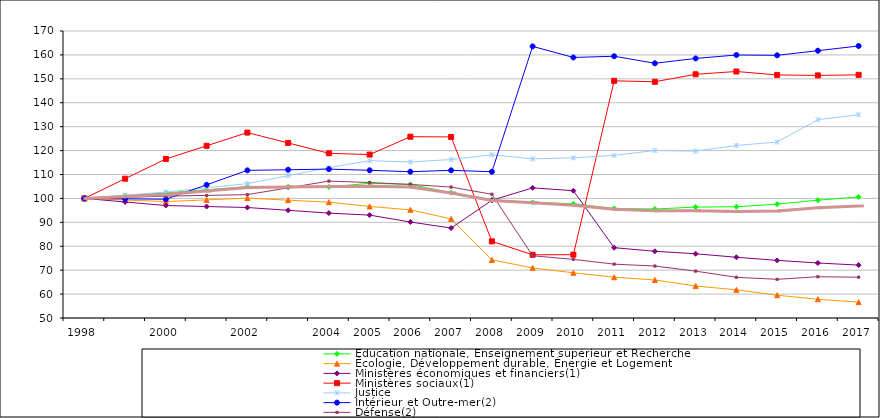
| Category | Éducation nationale, Enseignement supérieur et Recherche | Écologie, Développement durable, Énergie et Logement | Ministères économiques et financiers(1) | Ministères sociaux(1) | Justice | Intérieur et Outre-mer(2) | Défense(2) | Ensemble |
|---|---|---|---|---|---|---|---|---|
| 1998 | 100 | 100 | 100 | 100 | 100 | 100 | 100 | 100 |
|  | 101.145 | 99.34 | 98.512 | 108.251 | 101.343 | 99.828 | 100.468 | 100.833 |
| 2000 | 102.29 | 98.679 | 97.025 | 116.502 | 102.686 | 99.656 | 100.936 | 101.665 |
|  | 103.603 | 99.393 | 96.611 | 122.012 | 104.431 | 105.694 | 101.26 | 103.116 |
| 2002 | 104.917 | 100.107 | 96.198 | 127.523 | 106.176 | 111.732 | 101.584 | 104.567 |
|  | 104.851 | 99.266 | 95.029 | 123.195 | 109.517 | 111.989 | 104.417 | 104.787 |
| 2004 | 104.784 | 98.426 | 93.86 | 118.867 | 112.859 | 112.247 | 107.25 | 105.008 |
| 2005 | 106.317 | 96.634 | 93.015 | 118.329 | 115.782 | 111.751 | 106.641 | 105.086 |
| 2006 | 105.86 | 95.22 | 90.145 | 125.802 | 115.209 | 111.169 | 105.85 | 104.729 |
| 2007 | 102.405 | 91.451 | 87.603 | 125.71 | 116.276 | 111.747 | 104.745 | 102.282 |
| 2008 | 99.468 | 74.288 | 99.237 | 82.047 | 118.247 | 111.144 | 101.741 | 99.172 |
| 2009 | 98.34 | 70.949 | 104.415 | 76.433 | 116.541 | 163.575 | 76.024 | 98.163 |
| 2010 | 97.779 | 68.897 | 103.231 | 76.476 | 116.967 | 158.934 | 74.518 | 97.149 |
| 2011 | 95.802 | 67.061 | 79.393 | 149.157 | 117.992 | 159.448 | 72.515 | 95.481 |
| 2012 | 95.569 | 65.91 | 77.903 | 148.78 | 120.036 | 156.503 | 71.72 | 94.849 |
| 2013 | 96.365 | 63.386 | 76.859 | 151.896 | 119.785 | 158.526 | 69.592 | 94.878 |
| 2014 | 96.528 | 61.784 | 75.391 | 153.076 | 122.125 | 159.968 | 67.02 | 94.561 |
| 2015 | 97.617 | 59.526 | 74.085 | 151.628 | 123.573 | 159.832 | 66.167 | 94.776 |
| 2016 | 99.266 | 57.826 | 73.009 | 151.434 | 132.956 | 161.758 | 67.251 | 96.1 |
| 2017 | 100.611 | 56.628 | 72.112 | 151.666 | 134.982 | 163.735 | 67.055 | 96.84 |